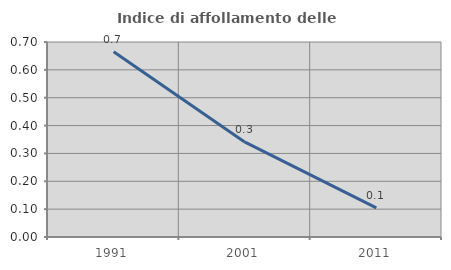
| Category | Indice di affollamento delle abitazioni  |
|---|---|
| 1991.0 | 0.665 |
| 2001.0 | 0.34 |
| 2011.0 | 0.105 |